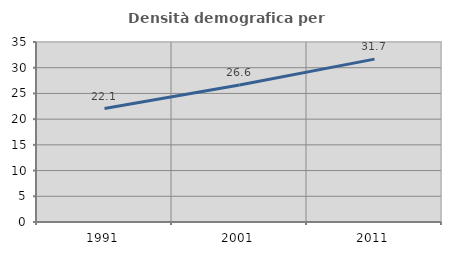
| Category | Densità demografica |
|---|---|
| 1991.0 | 22.067 |
| 2001.0 | 26.627 |
| 2011.0 | 31.667 |